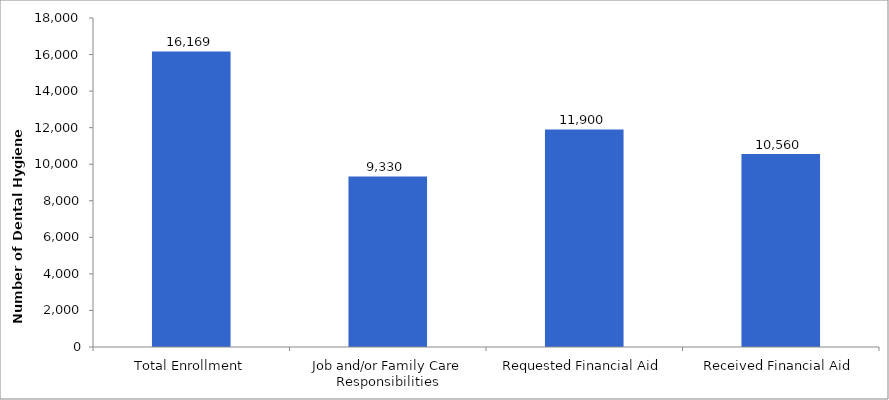
| Category | Number of Dental Hygiene Students |
|---|---|
| Total Enrollment | 16169 |
| Job and/or Family Care Responsibilities | 9330 |
| Requested Financial Aid | 11900 |
| Received Financial Aid | 10560 |